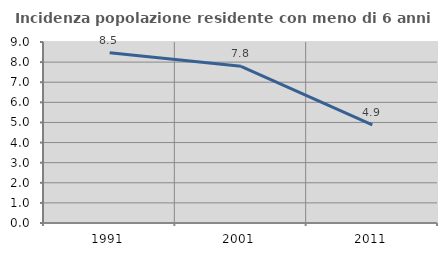
| Category | Incidenza popolazione residente con meno di 6 anni |
|---|---|
| 1991.0 | 8.462 |
| 2001.0 | 7.792 |
| 2011.0 | 4.875 |